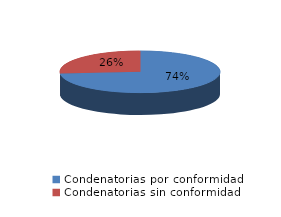
| Category | Series 0 |
|---|---|
| 0 | 768 |
| 1 | 273 |